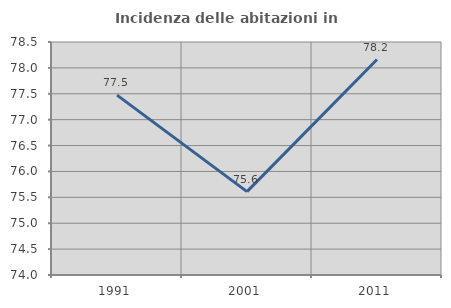
| Category | Incidenza delle abitazioni in proprietà  |
|---|---|
| 1991.0 | 77.474 |
| 2001.0 | 75.61 |
| 2011.0 | 78.161 |